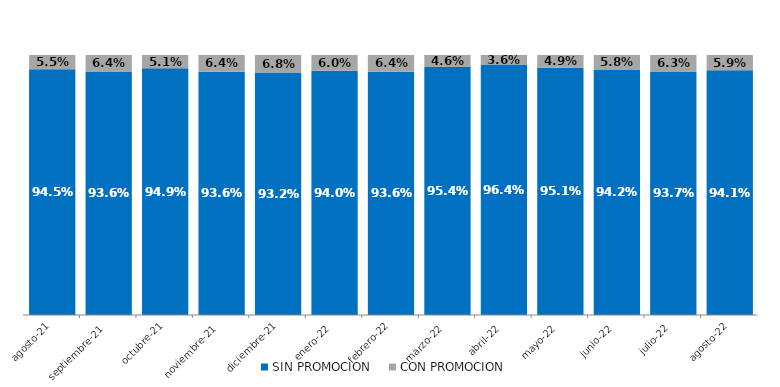
| Category | SIN PROMOCION   | CON PROMOCION   |
|---|---|---|
| 2021-08-01 | 0.945 | 0.055 |
| 2021-09-01 | 0.936 | 0.064 |
| 2021-10-01 | 0.949 | 0.051 |
| 2021-11-01 | 0.936 | 0.064 |
| 2021-12-01 | 0.932 | 0.068 |
| 2022-01-01 | 0.94 | 0.06 |
| 2022-02-01 | 0.936 | 0.064 |
| 2022-03-01 | 0.954 | 0.046 |
| 2022-04-01 | 0.964 | 0.036 |
| 2022-05-01 | 0.951 | 0.049 |
| 2022-06-01 | 0.942 | 0.058 |
| 2022-07-01 | 0.937 | 0.063 |
| 2022-08-01 | 0.941 | 0.059 |